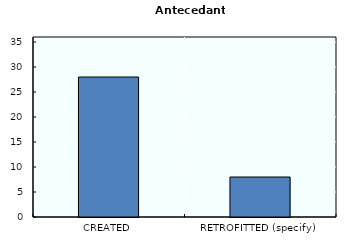
| Category | Antecedants |
|---|---|
| CREATED | 28 |
| RETROFITTED (specify) | 8 |